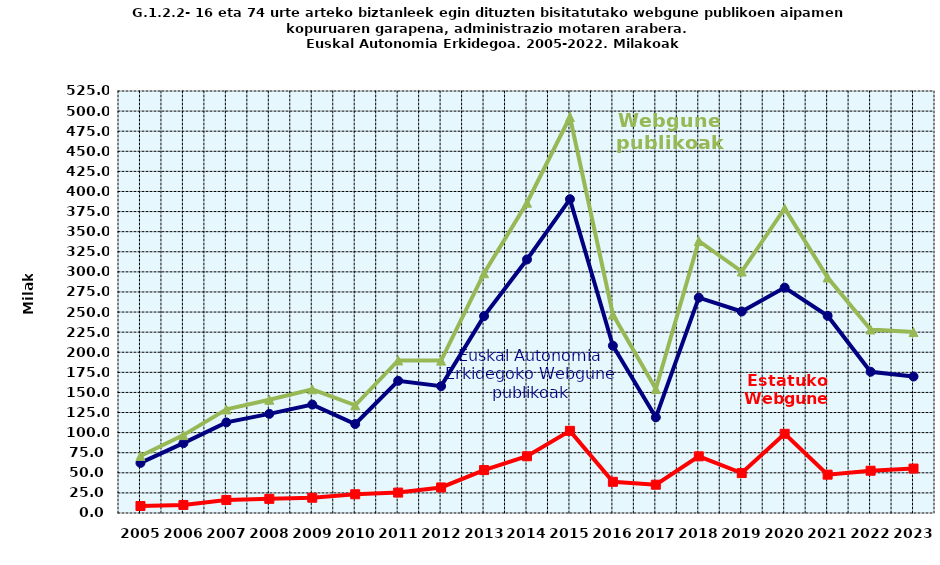
| Category | Euskal Autonomia Erkidegoko Webgune publikoak | Estatuko Webgune publikoak | Webgune publikoak guztira |
|---|---|---|---|
| 2005.0 | 62.3 | 8.7 | 71 |
| 2006.0 | 86.9 | 10 | 96.9 |
| 2007.0 | 112.7 | 16.2 | 128.9 |
| 2008.0 | 123.3 | 17.6 | 140.9 |
| 2009.0 | 134.9 | 19 | 153.9 |
| 2010.0 | 110.7 | 23.3 | 134 |
| 2011.0 | 164.4 | 25.4 | 189.8 |
| 2012.0 | 157.8 | 31.8 | 189.6 |
| 2013.0 | 244.9 | 53.4 | 298.3 |
| 2014.0 | 315.4 | 70.6 | 386 |
| 2015.0 | 390.4 | 102.2 | 492.6 |
| 2016.0 | 208.1 | 38.8 | 246.9 |
| 2017.0 | 119 | 35.2 | 154.2 |
| 2018.0 | 267.9 | 70.5 | 338.4 |
| 2019.0 | 250.7 | 49.7 | 300.4 |
| 2020.0 | 280.4 | 98.5 | 378.9 |
| 2021.0 | 245.3 | 47.7 | 293 |
| 2022.0 | 175.7 | 52.6 | 228.3 |
| 2023.0 | 169.8 | 55.3 | 225.1 |